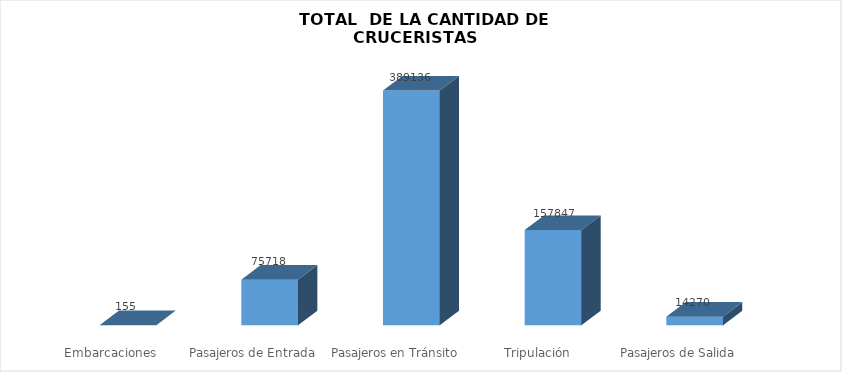
| Category | Series 0 |
|---|---|
| Embarcaciones  | 155 |
| Pasajeros de Entrada | 75718 |
| Pasajeros en Tránsito | 389136 |
| Tripulación | 157847 |
| Pasajeros de Salida | 14270 |